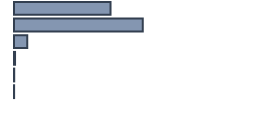
| Category | Percentatge |
|---|---|
| 0 | 40.217 |
| 1 | 53.652 |
| 2 | 5.565 |
| 3 | 0.435 |
| 4 | 0.087 |
| 5 | 0.043 |